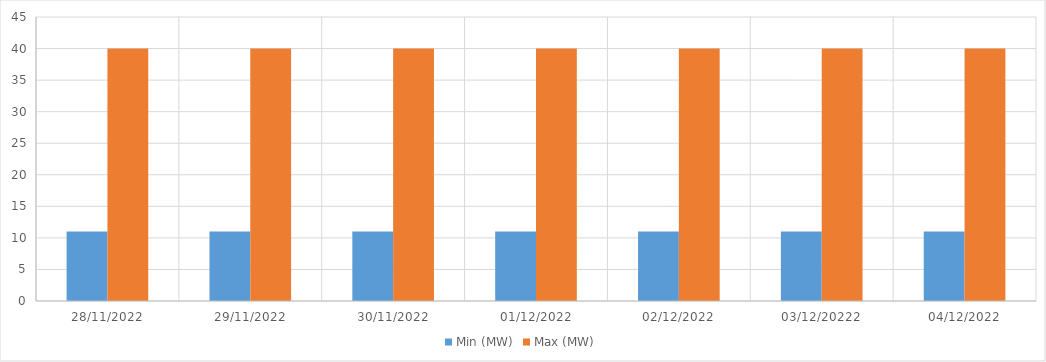
| Category | Min (MW) | Max (MW) |
|---|---|---|
| 28/11/2022 | 11 | 40 |
| 29/11/2022 | 11 | 40 |
| 30/11/2022 | 11 | 40 |
| 01/12/2022 | 11 | 40 |
| 02/12/2022 | 11 | 40 |
| 03/12/20222 | 11 | 40 |
| 04/12/2022 | 11 | 40 |